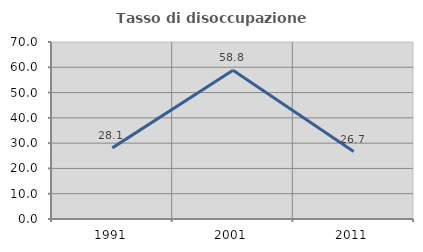
| Category | Tasso di disoccupazione giovanile  |
|---|---|
| 1991.0 | 28.125 |
| 2001.0 | 58.824 |
| 2011.0 | 26.667 |